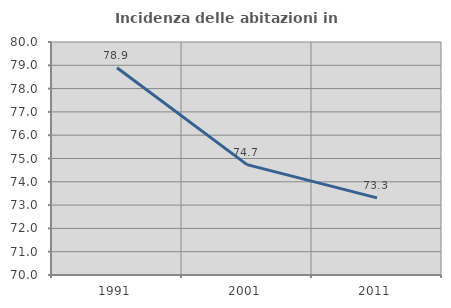
| Category | Incidenza delle abitazioni in proprietà  |
|---|---|
| 1991.0 | 78.892 |
| 2001.0 | 74.736 |
| 2011.0 | 73.308 |